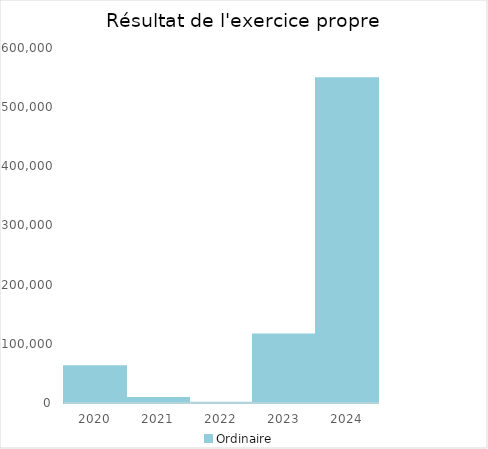
| Category |   | Ordinaire |    |
|---|---|---|---|
| 2020.0 |  | 62021.25 |  |
| 2021.0 |  | 8287.49 |  |
| 2022.0 |  | 304.04 |  |
| 2023.0 |  | 115770.41 |  |
| 2024.0 |  | 549023.68 |  |